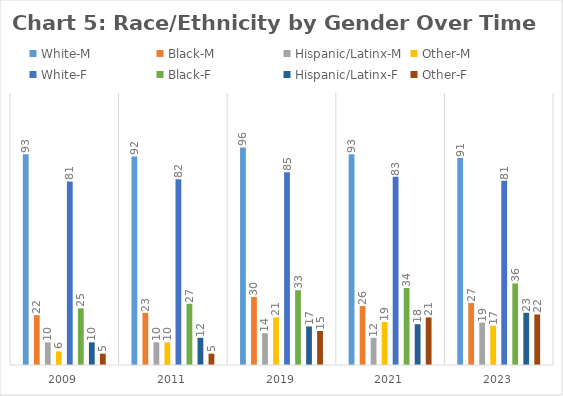
| Category | White-M | Black-M | Hispanic/Latinx-M | Other-M | White-F | Black-F | Hispanic/Latinx-F | Other-F |
|---|---|---|---|---|---|---|---|---|
| 2009.0 | 93 | 22 | 10 | 6 | 81 | 25 | 10 | 5 |
| 2011.0 | 92 | 23 | 10 | 10 | 82 | 27 | 12 | 5 |
| 2019.0 | 96 | 30 | 14 | 21 | 85 | 33 | 17 | 15 |
| 2021.0 | 93 | 26 | 12 | 19 | 83 | 34 | 18 | 21 |
| 2023.0 | 91.367 | 27.338 | 18.705 | 17.266 | 81.295 | 35.971 | 23.022 | 22.302 |